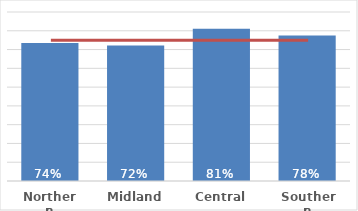
| Category | Dep 5 |
|---|---|
| Northern | 0.735 |
| Midland | 0.721 |
| Central | 0.811 |
| Southern | 0.775 |